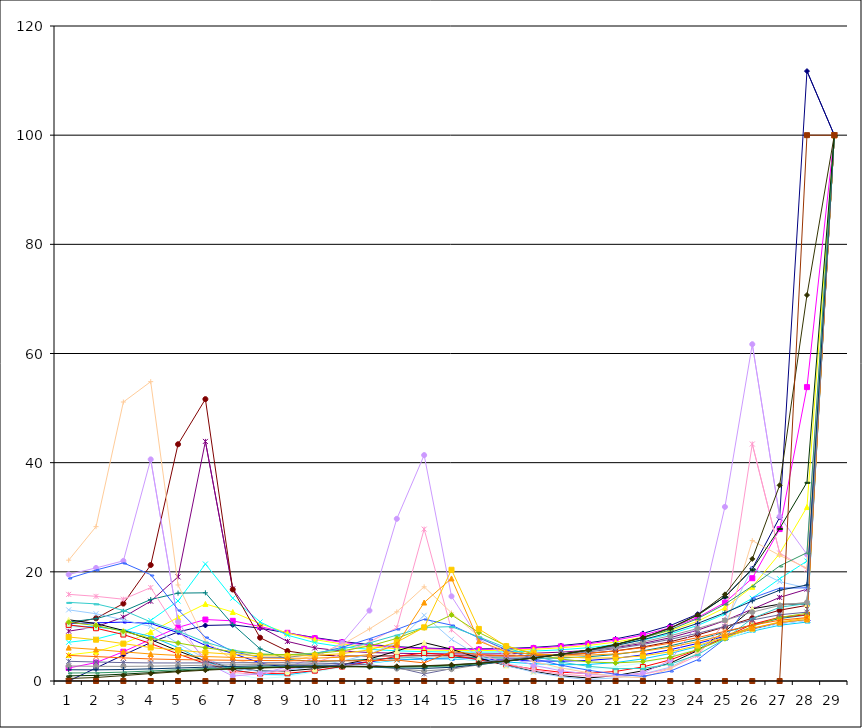
| Category | Series 0 | Series 1 | Series 2 | Series 3 | Series 4 | Series 5 | Series 6 | Series 7 | Series 8 | Series 9 | Series 10 | Series 11 | Series 12 | Series 13 | Series 14 | Series 15 | Series 16 | Series 17 | Series 18 | Series 19 | Series 20 | Series 21 | Series 22 | Series 23 | Series 24 | Series 25 | Series 26 | Series 27 | Series 28 |
|---|---|---|---|---|---|---|---|---|---|---|---|---|---|---|---|---|---|---|---|---|---|---|---|---|---|---|---|---|---|
| 0 | 0 | 2.383 | 4.773 | 7.099 | 9.13 | 10.467 | 10.801 | 10.525 | 10.133 | 9.973 | 10.271 | 11.22 | 13.029 | 15.875 | 19.519 | 22.131 | 18.794 | 14.399 | 10.752 | 8.06 | 6.115 | 4.688 | 3.606 | 2.755 | 2.059 | 1.467 | 0.944 | 0.462 | 0 |
| 1 | 2.383 | 3.37 | 5.368 | 7.668 | 9.914 | 11.475 | 11.415 | 10.648 | 9.902 | 9.518 | 9.668 | 10.516 | 12.325 | 15.511 | 20.718 | 28.278 | 20.331 | 14.131 | 10.16 | 7.567 | 5.778 | 4.475 | 3.481 | 2.691 | 2.042 | 1.494 | 1.023 | 0.64 | 0 |
| 2 | 4.759 | 5.363 | 6.853 | 8.998 | 11.688 | 14.182 | 12.776 | 10.788 | 9.331 | 8.57 | 8.511 | 9.267 | 11.202 | 14.983 | 22.008 | 51.114 | 21.646 | 12.954 | 9.089 | 6.853 | 5.347 | 4.236 | 3.371 | 2.674 | 2.102 | 1.63 | 1.252 | 0.992 | 0 |
| 3 | 7.042 | 7.632 | 8.984 | 11.102 | 14.614 | 21.245 | 14.927 | 10.537 | 8.174 | 7.073 | 6.864 | 7.579 | 9.985 | 17.114 | 40.603 | 54.841 | 19.483 | 10.828 | 7.802 | 6.128 | 4.951 | 4.04 | 3.309 | 2.712 | 2.225 | 1.833 | 1.54 | 1.358 | 0 |
| 4 | 8.986 | 9.812 | 11.652 | 14.654 | 19.072 | 43.373 | 16.1 | 8.841 | 6.119 | 5.08 | 4.96 | 5.523 | 6.891 | 9.241 | 10.865 | 17.591 | 13.055 | 9.127 | 6.961 | 5.638 | 4.682 | 3.923 | 3.301 | 2.791 | 2.379 | 2.057 | 1.826 | 1.693 | 0 |
| 5 | 10.178 | 11.261 | 14.121 | 21.434 | 43.895 | 51.64 | 16.158 | 6.523 | 3.55 | 2.921 | 3.179 | 3.653 | 4.082 | 4.13 | 3.366 | 7.285 | 8.019 | 7.114 | 6.098 | 5.226 | 4.485 | 3.853 | 3.321 | 2.883 | 2.533 | 2.265 | 2.08 | 1.978 | 0 |
| 6 | 10.287 | 11.021 | 12.636 | 15.18 | 16.889 | 16.766 | 10.361 | 5.069 | 2.108 | 1.339 | 1.942 | 2.4 | 2.36 | 1.56 | 0.907 | 3.892 | 5.381 | 5.655 | 5.372 | 4.875 | 4.325 | 3.801 | 3.342 | 2.962 | 2.662 | 2.438 | 2.287 | 2.207 | 0 |
| 7 | 9.679 | 9.982 | 10.502 | 10.822 | 9.876 | 7.931 | 5.884 | 3.316 | 1.186 | 0.407 | 1.367 | 1.839 | 1.76 | 1.152 | 1.318 | 3.032 | 4.337 | 4.908 | 4.934 | 4.643 | 4.211 | 3.757 | 3.349 | 3.013 | 2.754 | 2.566 | 2.442 | 2.379 | 0 |
| 8 | 8.806 | 8.83 | 8.787 | 8.39 | 7.249 | 5.485 | 3.956 | 2.416 | 1.13 | 0.835 | 1.41 | 1.842 | 2.004 | 2.102 | 2.587 | 3.478 | 4.316 | 4.771 | 4.818 | 4.569 | 4.161 | 3.722 | 3.333 | 3.025 | 2.799 | 2.643 | 2.545 | 2.497 | 0 |
| 9 | 7.949 | 7.844 | 7.584 | 7.031 | 6.061 | 4.768 | 3.561 | 2.527 | 1.824 | 1.653 | 1.894 | 2.253 | 2.681 | 3.358 | 4.246 | 4.689 | 4.984 | 5.118 | 5.013 | 4.676 | 4.193 | 3.698 | 3.283 | 2.985 | 2.791 | 2.672 | 2.603 | 2.571 | 0 |
| 10 | 7.232 | 7.086 | 6.777 | 6.254 | 5.495 | 4.582 | 3.717 | 3.026 | 2.601 | 2.491 | 2.642 | 2.983 | 3.632 | 5.015 | 6.991 | 6.651 | 6.174 | 5.868 | 5.521 | 5.011 | 4.353 | 3.689 | 3.178 | 2.873 | 2.722 | 2.654 | 2.625 | 2.614 | 0 |
| 11 | 6.683 | 6.537 | 6.246 | 5.801 | 5.219 | 4.57 | 3.971 | 3.52 | 3.286 | 3.299 | 3.553 | 4.034 | 4.885 | 7.165 | 12.905 | 9.54 | 7.755 | 6.979 | 6.408 | 5.715 | 4.847 | 3.725 | 2.96 | 2.649 | 2.586 | 2.603 | 2.631 | 2.647 | 0 |
| 12 | 6.291 | 6.16 | 5.903 | 5.533 | 5.079 | 4.601 | 4.178 | 3.89 | 3.802 | 3.98 | 4.506 | 5.507 | 7.098 | 9.76 | 29.714 | 12.671 | 9.445 | 8.399 | 7.797 | 7.104 | 6.696 | 3.833 | 2.467 | 2.267 | 2.405 | 2.553 | 2.651 | 2.696 | 0 |
| 13 | 6.037 | 5.92 | 5.694 | 5.378 | 5.004 | 4.622 | 4.295 | 4.089 | 4.073 | 4.351 | 5.138 | 7.035 | 12.038 | 27.827 | 41.383 | 17.255 | 11.321 | 9.82 | 9.748 | 9.832 | 14.375 | 3.317 | 1.309 | 1.844 | 2.302 | 2.577 | 2.731 | 2.797 | 0 |
| 14 | 5.902 | 5.793 | 5.586 | 5.299 | 4.963 | 4.619 | 4.317 | 4.109 | 4.051 | 4.222 | 4.748 | 5.829 | 7.631 | 9.382 | 15.516 | 12.479 | 10.232 | 9.953 | 12.1 | 20.38 | 18.79 | 5.379 | 2.266 | 2.169 | 2.508 | 2.765 | 2.917 | 2.982 | 0 |
| 15 | 5.876 | 5.769 | 5.565 | 5.284 | 4.951 | 4.602 | 4.27 | 3.995 | 3.812 | 3.764 | 3.891 | 4.203 | 4.597 | 5.055 | 7.736 | 8.169 | 7.905 | 8.082 | 8.884 | 9.539 | 7.307 | 4.862 | 3.374 | 2.965 | 3.006 | 3.134 | 3.233 | 3.274 | 0 |
| 16 | 5.957 | 5.844 | 5.632 | 5.337 | 4.983 | 4.596 | 4.201 | 3.821 | 3.478 | 3.191 | 2.978 | 2.841 | 2.808 | 3.184 | 4.543 | 5.366 | 5.744 | 6.095 | 6.451 | 6.381 | 5.364 | 4.578 | 3.949 | 3.655 | 3.596 | 3.631 | 3.672 | 3.681 | 0 |
| 17 | 6.154 | 6.028 | 5.796 | 5.474 | 5.082 | 4.64 | 4.165 | 3.671 | 3.166 | 2.662 | 2.18 | 1.779 | 1.631 | 2.016 | 2.871 | 3.579 | 4.092 | 4.55 | 4.941 | 5.097 | 4.895 | 4.647 | 4.408 | 4.263 | 4.214 | 4.216 | 4.222 | 4.205 | 0 |
| 18 | 6.488 | 6.34 | 6.077 | 5.718 | 5.28 | 4.778 | 4.224 | 3.626 | 2.984 | 2.303 | 1.601 | 0.966 | 0.787 | 1.271 | 1.882 | 2.394 | 2.888 | 3.448 | 4.019 | 4.472 | 4.721 | 4.824 | 4.848 | 4.857 | 4.874 | 4.892 | 4.89 | 4.857 | 0 |
| 19 | 6.989 | 6.809 | 6.507 | 6.104 | 5.616 | 5.058 | 4.438 | 3.763 | 3.031 | 2.243 | 1.408 | 0.555 | 0.252 | 0.89 | 1.28 | 1.532 | 1.978 | 2.694 | 3.494 | 4.204 | 4.738 | 5.099 | 5.336 | 5.5 | 5.616 | 5.685 | 5.701 | 5.659 | 0 |
| 20 | 7.708 | 7.481 | 7.128 | 6.674 | 6.135 | 5.526 | 4.859 | 4.141 | 3.377 | 2.575 | 1.752 | 0.978 | 0.583 | 0.855 | 0.983 | 0.772 | 1.228 | 2.26 | 3.319 | 4.237 | 4.964 | 5.516 | 5.932 | 6.252 | 6.493 | 6.648 | 6.705 | 6.663 | 0 |
| 21 | 8.723 | 8.423 | 8.002 | 7.485 | 6.888 | 6.227 | 5.524 | 4.794 | 4.052 | 3.31 | 2.578 | 1.872 | 1.288 | 1.226 | 1.468 | 0.627 | 0.86 | 2.296 | 3.559 | 4.599 | 5.438 | 6.119 | 6.686 | 7.168 | 7.566 | 7.854 | 7.989 | 7.953 | 0 |
| 22 | 10.161 | 9.74 | 9.221 | 8.614 | 7.928 | 7.194 | 6.448 | 5.723 | 5.045 | 4.432 | 3.871 | 3.28 | 2.534 | 2.322 | 3.757 | 2.266 | 1.803 | 3.086 | 4.333 | 5.347 | 6.191 | 6.935 | 7.627 | 8.287 | 8.9 | 9.402 | 9.689 | 9.679 | 0 |
| 23 | 12.245 | 11.609 | 10.938 | 10.169 | 9.311 | 8.435 | 7.611 | 6.89 | 6.312 | 5.915 | 5.709 | 5.569 | 5.078 | 4.665 | 10.41 | 5.16 | 3.897 | 4.825 | 5.739 | 6.505 | 7.22 | 7.952 | 8.745 | 9.619 | 10.546 | 11.423 | 12.035 | 12.122 | 0 |
| 24 | 15.404 | 14.365 | 13.431 | 12.297 | 11.069 | 9.917 | 8.942 | 8.2 | 7.741 | 7.647 | 8.051 | 9.094 | 10.546 | 10.618 | 31.899 | 9.251 | 7.715 | 7.693 | 7.758 | 8.003 | 8.447 | 9.098 | 9.976 | 11.113 | 12.51 | 14.064 | 15.419 | 15.871 | 0 |
| 25 | 20.56 | 18.83 | 17.247 | 15.163 | 13.158 | 11.516 | 10.294 | 9.49 | 9.129 | 9.325 | 10.395 | 13.226 | 20.671 | 43.421 | 61.699 | 25.723 | 15.19 | 11.47 | 10.036 | 9.585 | 9.693 | 10.226 | 11.177 | 12.618 | 14.668 | 17.396 | 20.481 | 22.37 | 0 |
| 26 | 29.959 | 27.833 | 23.342 | 18.732 | 15.313 | 12.971 | 11.439 | 10.54 | 10.213 | 10.519 | 11.67 | 14.069 | 18.193 | 23.443 | 30.15 | 23.006 | 17.017 | 13.502 | 11.648 | 10.825 | 10.698 | 11.132 | 12.133 | 13.849 | 16.622 | 21.076 | 27.947 | 35.854 | 0 |
| 27 | 111.739 | 53.841 | 31.867 | 21.974 | 16.819 | 13.857 | 12.099 | 11.132 | 10.8 | 11.101 | 12.143 | 14.098 | 17.034 | 20.471 | 23.206 | 20.694 | 17.065 | 14.21 | 12.405 | 11.482 | 11.253 | 11.623 | 12.617 | 14.43 | 17.593 | 23.51 | 36.402 | 70.712 | 100 |
| 28 | 100 | 100 | 100 | 100 | 100 | 100 | 100 | 100 | 100 | 100 | 100 | 100 | 100 | 100 | 100 | 100 | 100 | 100 | 100 | 100 | 100 | 100 | 100 | 100 | 100 | 100 | 100 | 100 | 100 |